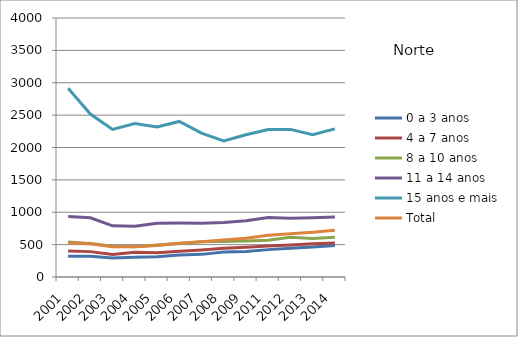
| Category | 0 a 3 anos | 4 a 7 anos | 8 a 10 anos | 11 a 14 anos | 15 anos e mais | Total |
|---|---|---|---|---|---|---|
| 2001.0 | 318.8 | 400.2 | 539.7 | 933.4 | 2913.5 | 524.5 |
| 2002.0 | 322.2 | 391.9 | 517.8 | 913.6 | 2517.2 | 515.2 |
| 2003.0 | 293.8 | 347.1 | 474.2 | 789.7 | 2279.3 | 467.5 |
| 2004.0 | 303.4 | 383.2 | 469.1 | 782.3 | 2369.3 | 468.1 |
| 2005.0 | 312.4 | 374.5 | 493.2 | 830.5 | 2316.4 | 485.4 |
| 2006.0 | 339.1 | 396.5 | 515.6 | 834.2 | 2402.1 | 522.6 |
| 2007.0 | 349.5 | 418.6 | 543.4 | 830.7 | 2223.1 | 544.6 |
| 2008.0 | 385.4 | 443.2 | 549.8 | 842 | 2101.6 | 573.1 |
| 2009.0 | 394.9 | 460 | 557.9 | 867.5 | 2197.3 | 599.4 |
| 2011.0 | 422.8 | 478.4 | 569.2 | 920.2 | 2277.5 | 643.2 |
| 2012.0 | 443.3 | 495.9 | 612.9 | 907.2 | 2279.8 | 669.2 |
| 2013.0 | 462.6 | 515 | 595.5 | 916.7 | 2196.5 | 689.3 |
| 2014.0 | 486 | 525.9 | 615 | 926.7 | 2288.4 | 721.4 |